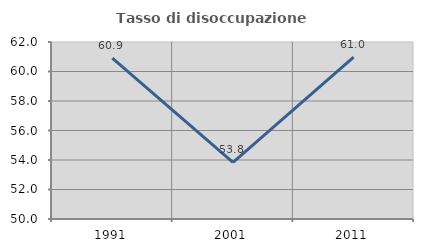
| Category | Tasso di disoccupazione giovanile  |
|---|---|
| 1991.0 | 60.909 |
| 2001.0 | 53.846 |
| 2011.0 | 60.976 |